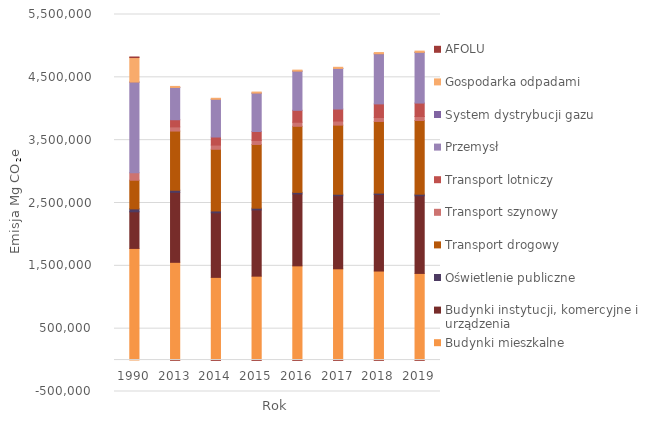
| Category | Budynki mieszkalne | Budynki instytucji, komercyjne i urządzenia | Oświetlenie publiczne | Transport drogowy | Transport szynowy | Transport lotniczy | Przemysł | System dystrybucji gazu | Gospodarka odpadami | AFOLU |
|---|---|---|---|---|---|---|---|---|---|---|
| 1990.0 | 1777035 | 583207 | 46541 | 455476 | 118779 | 0 | 1442928 | 169 | 390686 | 9064 |
| 2013.0 | 1555853 | 1114007 | 33413 | 941650 | 66053 | 114480 | 513222 | 97 | 16741 | -3978 |
| 2014.0 | 1316260 | 1027686 | 29702 | 981307 | 66725 | 128437 | 599911 | 97 | 16483 | -5028 |
| 2015.0 | 1335603 | 1054596 | 26838 | 1014791 | 64502 | 141806 | 610393 | 110 | 16937 | -5139 |
| 2016.0 | 1499768 | 1145131 | 24256 | 1051632 | 64508 | 189744 | 623177 | 110 | 16467 | -5024 |
| 2017.0 | 1452910 | 1162780 | 23418 | 1099967 | 65196 | 190983 | 646077 | 110 | 18332 | -5031 |
| 2018.0 | 1417181 | 1217941 | 22534 | 1139908 | 63433 | 216337 | 796956 | 102 | 19662 | -4448 |
| 2019.0 | 1379351 | 1235521 | 25185 | 1172607 | 63645 | 214370 | 806825 | 102 | 19757 | -4444 |